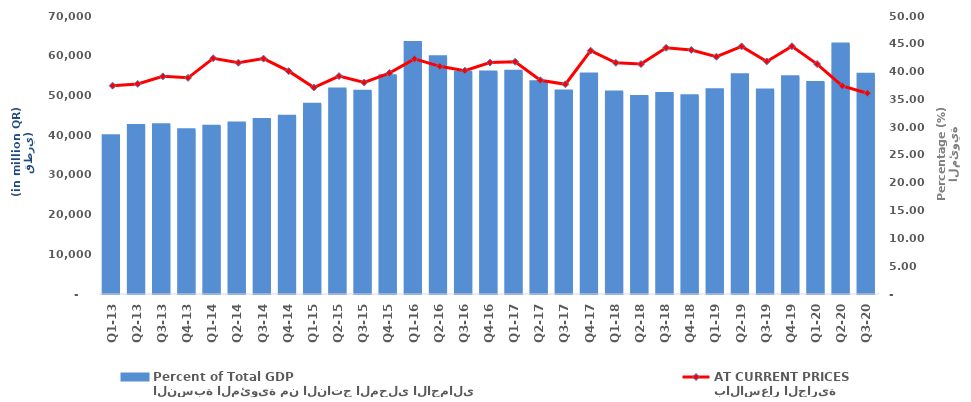
| Category | النسبة المئوية من الناتج المحلي الاجمالي
Percent of Total GDP |
|---|---|
| Q1-13 | 28.448 |
| Q2-13 | 30.301 |
| Q3-13 | 30.438 |
| Q4-13 | 29.527 |
| Q1-14 | 30.151 |
| Q2-14 | 30.756 |
| Q3-14 | 31.389 |
| Q4-14 | 31.951 |
| Q1-15 | 34.139 |
| Q2-15 | 36.869 |
| Q3-15 | 36.486 |
| Q4-15 | 39.272 |
| Q1-16 | 45.24 |
| Q2-16 | 42.68 |
| Q3-16 | 39.862 |
| Q4-16 | 39.906 |
| Q1-17 | 40.062 |
| Q2-17 | 38.175 |
| Q3-17 | 36.524 |
| Q4-17 | 39.567 |
| Q1-18 | 36.349 |
| Q2-18 | 35.531 |
| Q3-18 | 36.056 |
| Q4-18 | 35.663 |
| Q1-19 | 36.718 |
| Q2-19 | 39.43 |
| Q3-19 | 36.7 |
| Q4-19 | 39.079 |
| Q1-20 | 38.046 |
| Q2-20 | 44.949 |
| Q3-20 | 39.543 |